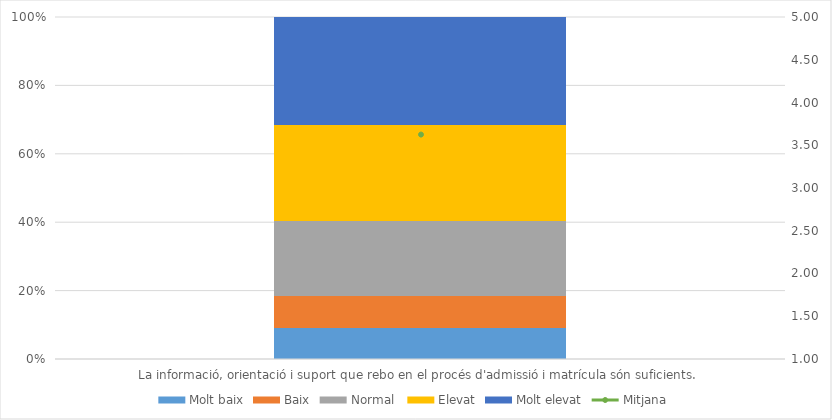
| Category | Molt baix | Baix | Normal  | Elevat | Molt elevat |
|---|---|---|---|---|---|
| La informació, orientació i suport que rebo en el procés d'admissió i matrícula són suficients. | 3 | 3 | 7 | 9 | 10 |